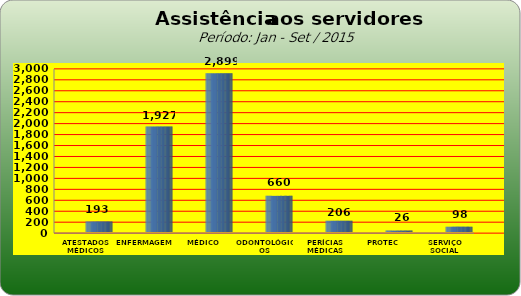
| Category | Series 0 |
|---|---|
| ATESTADOS MÉDICOS | 193 |
| ENFERMAGEM | 1927 |
| MÉDICO | 2899 |
| ODONTOLÓGICOS | 660 |
| PERÍCIAS MÉDICAS | 206 |
| PROTEC | 26 |
| SERVIÇO SOCIAL | 98 |